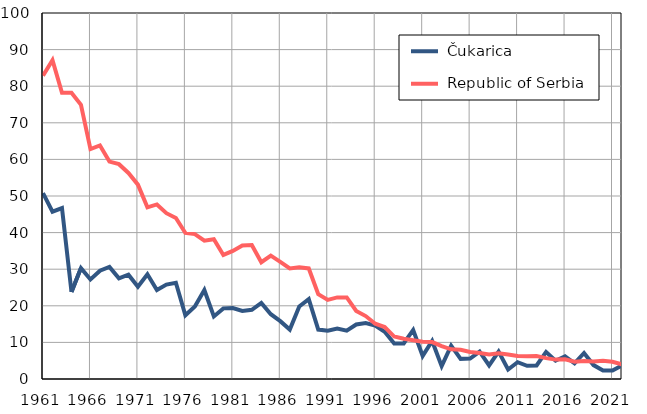
| Category |  Čukarica |  Republic of Serbia |
|---|---|---|
| 1961.0 | 50.8 | 82.9 |
| 1962.0 | 45.7 | 87.1 |
| 1963.0 | 46.7 | 78.2 |
| 1964.0 | 23.8 | 78.2 |
| 1965.0 | 30.3 | 74.9 |
| 1966.0 | 27.2 | 62.8 |
| 1967.0 | 29.6 | 63.8 |
| 1968.0 | 30.6 | 59.4 |
| 1969.0 | 27.5 | 58.7 |
| 1970.0 | 28.5 | 56.3 |
| 1971.0 | 25.2 | 53.1 |
| 1972.0 | 28.6 | 46.9 |
| 1973.0 | 24.3 | 47.7 |
| 1974.0 | 25.8 | 45.3 |
| 1975.0 | 26.3 | 44 |
| 1976.0 | 17.4 | 39.9 |
| 1977.0 | 19.8 | 39.6 |
| 1978.0 | 24.3 | 37.8 |
| 1979.0 | 17.1 | 38.2 |
| 1980.0 | 19.3 | 33.9 |
| 1981.0 | 19.4 | 35 |
| 1982.0 | 18.6 | 36.5 |
| 1983.0 | 18.9 | 36.6 |
| 1984.0 | 20.8 | 31.9 |
| 1985.0 | 17.7 | 33.7 |
| 1986.0 | 15.8 | 32 |
| 1987.0 | 13.5 | 30.2 |
| 1988.0 | 19.8 | 30.5 |
| 1989.0 | 21.8 | 30.2 |
| 1990.0 | 13.5 | 23.2 |
| 1991.0 | 13.2 | 21.6 |
| 1992.0 | 13.8 | 22.3 |
| 1993.0 | 13.2 | 22.3 |
| 1994.0 | 14.9 | 18.6 |
| 1995.0 | 15.3 | 17.2 |
| 1996.0 | 14.6 | 15.1 |
| 1997.0 | 12.9 | 14.2 |
| 1998.0 | 9.7 | 11.6 |
| 1999.0 | 9.7 | 11 |
| 2000.0 | 13.4 | 10.6 |
| 2001.0 | 6.3 | 10.2 |
| 2002.0 | 10.4 | 10.1 |
| 2003.0 | 3.5 | 9 |
| 2004.0 | 9.1 | 8.1 |
| 2005.0 | 5.5 | 8 |
| 2006.0 | 5.6 | 7.4 |
| 2007.0 | 7.5 | 7.1 |
| 2008.0 | 3.7 | 6.7 |
| 2009.0 | 7.5 | 7 |
| 2010.0 | 2.6 | 6.7 |
| 2011.0 | 4.6 | 6.3 |
| 2012.0 | 3.6 | 6.2 |
| 2013.0 | 3.7 | 6.3 |
| 2014.0 | 7.4 | 5.7 |
| 2015.0 | 5 | 5.3 |
| 2016.0 | 6.2 | 5.4 |
| 2017.0 | 4.3 | 4.7 |
| 2018.0 | 7.1 | 4.9 |
| 2019.0 | 3.8 | 4.8 |
| 2020.0 | 2.3 | 5 |
| 2021.0 | 2.3 | 4.7 |
| 2022.0 | 3.7 | 4 |